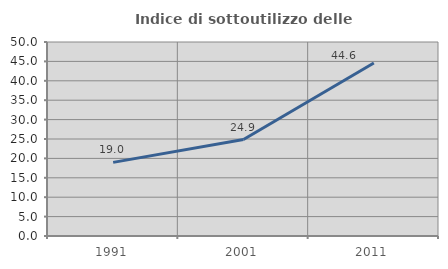
| Category | Indice di sottoutilizzo delle abitazioni  |
|---|---|
| 1991.0 | 18.974 |
| 2001.0 | 24.857 |
| 2011.0 | 44.603 |